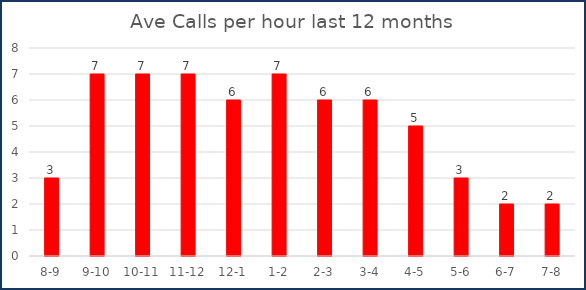
| Category | Ave calls YTD |
|---|---|
| 8-9 | 3 |
| 9-10 | 7 |
| 10-11 | 7 |
| 11-12 | 7 |
| 12-1 | 6 |
| 1-2 | 7 |
| 2-3 | 6 |
| 3-4 | 6 |
| 4-5 | 5 |
| 5-6 | 3 |
| 6-7 | 2 |
| 7-8 | 2 |